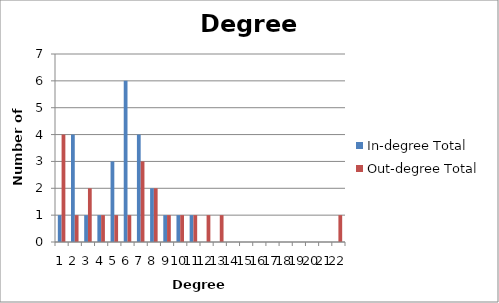
| Category | In-degree Total | Out-degree Total |
|---|---|---|
| 0 | 1 | 4 |
| 1 | 4 | 1 |
| 2 | 1 | 2 |
| 3 | 1 | 1 |
| 4 | 3 | 1 |
| 5 | 6 | 1 |
| 6 | 4 | 3 |
| 7 | 2 | 2 |
| 8 | 1 | 1 |
| 9 | 1 | 1 |
| 10 | 1 | 1 |
| 11 | 0 | 1 |
| 12 | 0 | 1 |
| 13 | 0 | 0 |
| 14 | 0 | 0 |
| 15 | 0 | 0 |
| 16 | 0 | 0 |
| 17 | 0 | 0 |
| 18 | 0 | 0 |
| 19 | 0 | 0 |
| 20 | 0 | 0 |
| 21 | 0 | 1 |